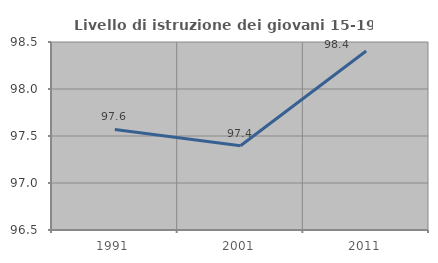
| Category | Livello di istruzione dei giovani 15-19 anni |
|---|---|
| 1991.0 | 97.569 |
| 2001.0 | 97.396 |
| 2011.0 | 98.404 |